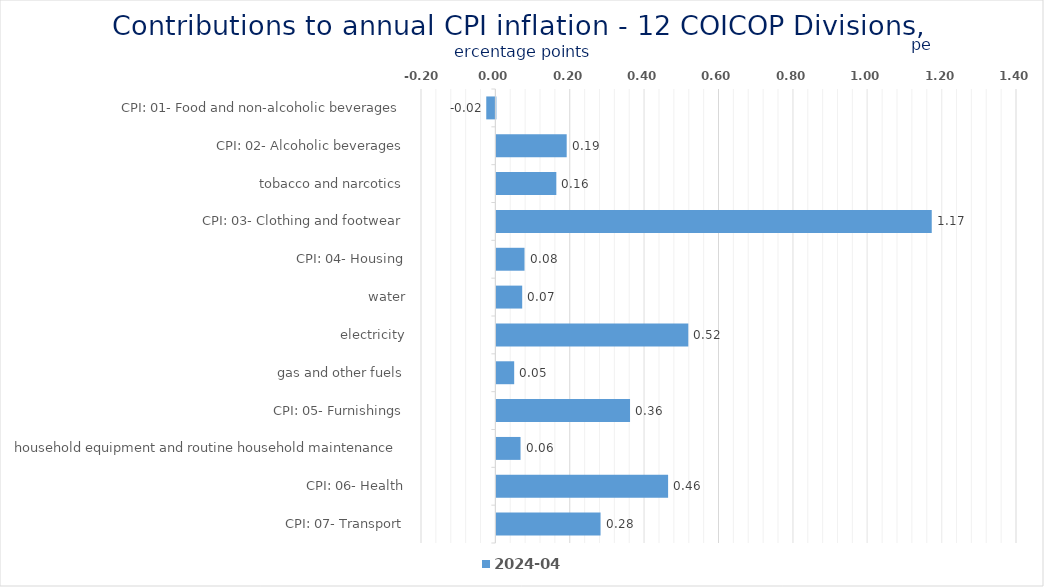
| Category | 2024-04 |
|---|---|
| CPI: 01- Food and non-alcoholic beverages | -0.025 |
| CPI: 02- Alcoholic beverages, tobacco and narcotics | 0.189 |
| CPI: 03- Clothing and footwear | 0.161 |
| CPI: 04- Housing, water, electricity, gas and other fuels | 1.171 |
| CPI: 05- Furnishings, household equipment and routine household maintenance | 0.076 |
| CPI: 06- Health | 0.069 |
| CPI: 07- Transport | 0.516 |
| CPI: 08- Communication | 0.048 |
| CPI: 09- Recreation and culture | 0.359 |
| CPI: 10- Education | 0.065 |
| CPI: 11- Restaurants and hotels | 0.462 |
| CPI: 12- Miscellaneous goods and services | 0.28 |